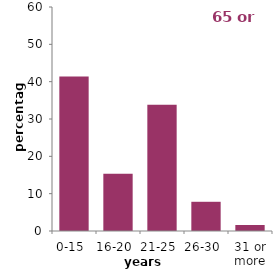
| Category | 65 or over |
|---|---|
| 0-15  | 41.409 |
| 16-20  | 15.325 |
| 21-25  | 33.828 |
| 26-30  | 7.825 |
| 31 or more | 1.612 |